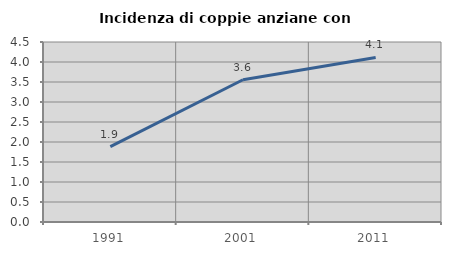
| Category | Incidenza di coppie anziane con figli |
|---|---|
| 1991.0 | 1.885 |
| 2001.0 | 3.557 |
| 2011.0 | 4.114 |